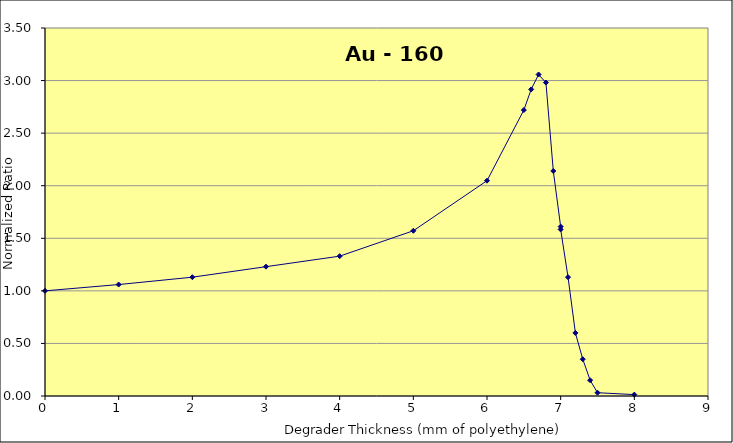
| Category | Series 0 |
|---|---|
| 0.0 | 1 |
| 1.0 | 1.06 |
| 2.0 | 1.13 |
| 3.0 | 1.23 |
| 4.0 | 1.33 |
| 5.0 | 1.571 |
| 6.0 | 2.048 |
| 6.5 | 2.72 |
| 6.6 | 2.916 |
| 6.7 | 3.058 |
| 6.8 | 2.981 |
| 6.9 | 2.14 |
| 7.0 | 1.611 |
| 7.0 | 1.584 |
| 7.1 | 1.13 |
| 7.2 | 0.6 |
| 7.3 | 0.35 |
| 7.4 | 0.15 |
| 7.5 | 0.031 |
| 8.0 | 0.013 |